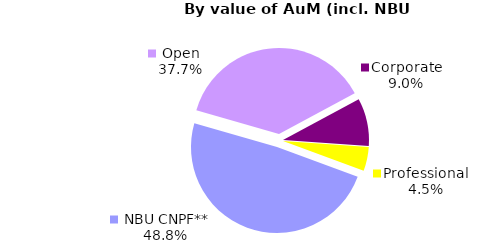
| Category | Series 0 |
|---|---|
| Open | 1180.406 |
| Corporate | 281.39 |
| Professional | 141.356 |
|  NBU CNPF** | 1528.548 |